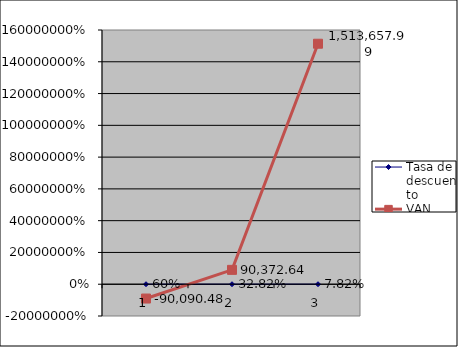
| Category | Tasa de descuento | VAN |
|---|---|---|
| 0 | 0.6 | -90090.485 |
| 1 | 0.328 | 90372.636 |
| 2 | 0.078 | 1513657.995 |